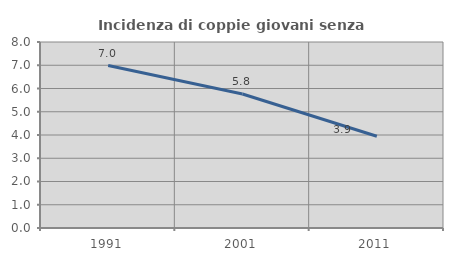
| Category | Incidenza di coppie giovani senza figli |
|---|---|
| 1991.0 | 6.986 |
| 2001.0 | 5.764 |
| 2011.0 | 3.945 |